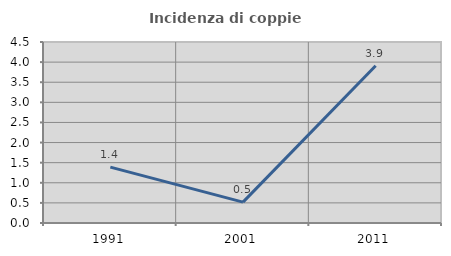
| Category | Incidenza di coppie miste |
|---|---|
| 1991.0 | 1.389 |
| 2001.0 | 0.518 |
| 2011.0 | 3.911 |